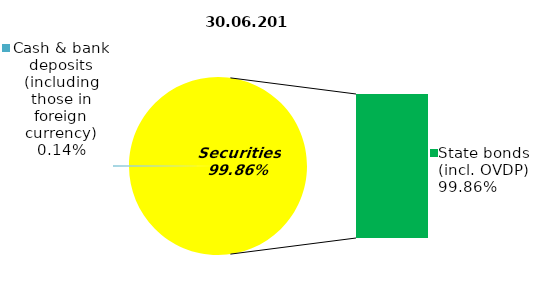
| Category | Series 0 |
|---|---|
| Cash & bank deposits (including those in foreign currency) | 0.13 |
| Bank metals | 0 |
| Real estate | 0 |
| Other assets | 0 |
| Equities | 0 |
| Corporate bonds | 0 |
| Municipal bonds | 0 |
| State bonds (incl. OVDP) | 92.62 |
| Mortgage notes | 0 |